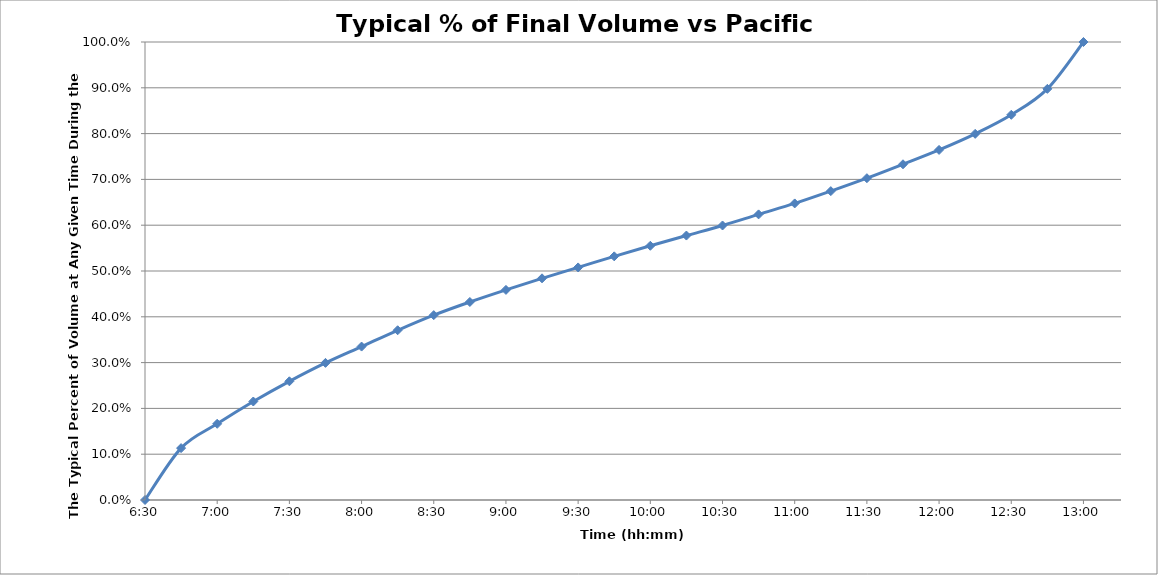
| Category | Series 0 |
|---|---|
| 0.2708333333333333 | 0 |
| 0.28125 | 0.113 |
| 0.2916666666666667 | 0.166 |
| 0.3020833333333333 | 0.215 |
| 0.3125 | 0.259 |
| 0.3229166666666667 | 0.299 |
| 0.3333333333333333 | 0.335 |
| 0.34375 | 0.371 |
| 0.3541666666666667 | 0.404 |
| 0.3645833333333333 | 0.432 |
| 0.375 | 0.459 |
| 0.3854166666666667 | 0.484 |
| 0.3958333333333333 | 0.508 |
| 0.40625 | 0.532 |
| 0.4166666666666667 | 0.555 |
| 0.4270833333333333 | 0.577 |
| 0.4375 | 0.599 |
| 0.4479166666666667 | 0.624 |
| 0.4583333333333333 | 0.648 |
| 0.46875 | 0.674 |
| 0.4791666666666667 | 0.703 |
| 0.4895833333333333 | 0.733 |
| 0.5 | 0.764 |
| 0.5104166666666666 | 0.799 |
| 0.5208333333333334 | 0.841 |
| 0.53125 | 0.898 |
| 0.5416666666666666 | 1 |